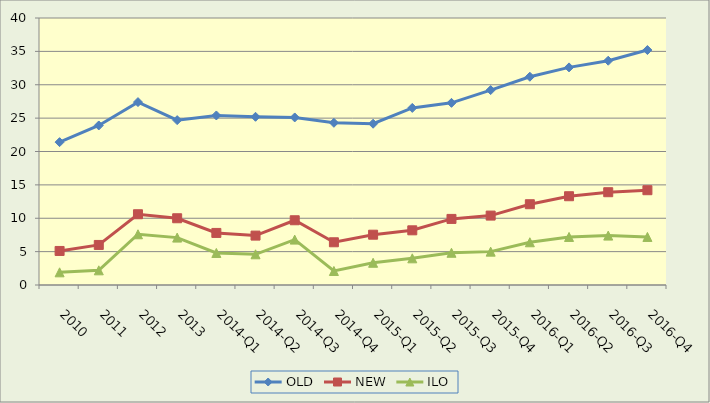
| Category | OLD | NEW | ILO |
|---|---|---|---|
| 2010 | 21.4 | 5.1 | 1.9 |
| 2011 | 23.9 | 6 | 2.2 |
| 2012 | 27.4 | 10.6 | 7.6 |
| 2013 | 24.7 | 10 | 7.1 |
| 2014-Q1 | 25.4 | 7.8 | 4.8 |
| 2014-Q2 | 25.2 | 7.4 | 4.6 |
| 2014-Q3 | 25.1 | 9.7 | 6.8 |
| 2014-Q4 | 24.3 | 6.4 | 2.1 |
| 2015-Q1 | 24.16 | 7.535 | 3.331 |
| 2015-Q2 | 26.529 | 8.193 | 3.996 |
| 2015-Q3 | 27.289 | 9.9 | 4.829 |
| 2015-Q4 | 29.2 | 10.4 | 5 |
| 2016-Q1 | 31.2 | 12.1 | 6.4 |
| 2016-Q2 | 32.6 | 13.3 | 7.2 |
| 2016-Q3 | 33.6 | 13.9 | 7.4 |
| 2016-Q4 | 35.2 | 14.2 | 7.2 |